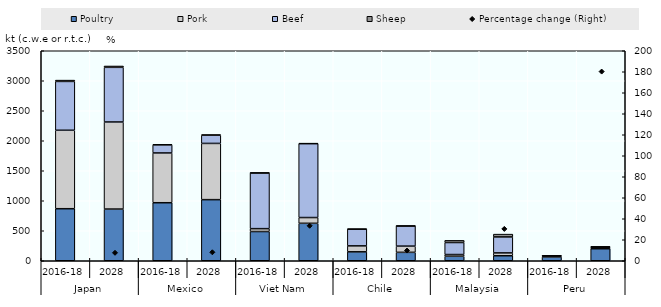
| Category | Poultry | Pork | Beef | Sheep |
|---|---|---|---|---|
| 0 | 867.408 | 1307.547 | 813.852 | 21.915 |
| 1 | 861.516 | 1451.362 | 910.953 | 22.519 |
| 2 | 967 | 829.653 | 134.149 | 10.399 |
| 3 | 1018.231 | 937.394 | 136.969 | 9.605 |
| 4 | 487.122 | 47.93 | 929.243 | 1 |
| 5 | 624.093 | 95.999 | 1231.748 | 5.019 |
| 6 | 148.858 | 99.076 | 279.932 | 0.02 |
| 7 | 140.228 | 103.721 | 336.522 | 0.037 |
| 8 | 74.537 | 29.094 | 200.529 | 35.907 |
| 9 | 83.419 | 47.318 | 266.506 | 46.764 |
| 10 | 64.295 | 11.503 | 6.63 | 0.004 |
| 11 | 200.44 | 23.381 | 7.309 | 0.009 |